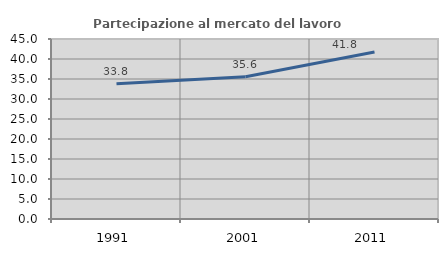
| Category | Partecipazione al mercato del lavoro  femminile |
|---|---|
| 1991.0 | 33.783 |
| 2001.0 | 35.585 |
| 2011.0 | 41.768 |